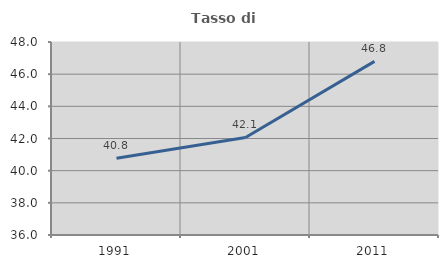
| Category | Tasso di occupazione   |
|---|---|
| 1991.0 | 40.778 |
| 2001.0 | 42.065 |
| 2011.0 | 46.796 |